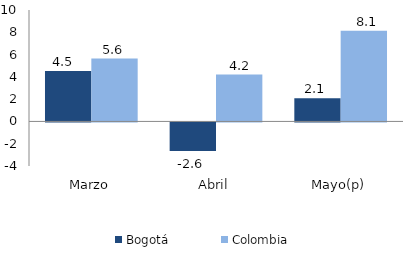
| Category | Bogotá | Colombia |
|---|---|---|
| Marzo | 4.515 | 5.642 |
| Abril | -2.573 | 4.201 |
| Mayo(p) | 2.081 | 8.149 |